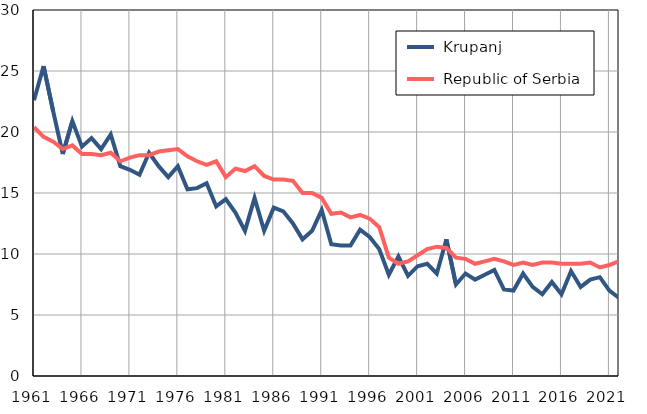
| Category |  Krupanj |  Republic of Serbia |
|---|---|---|
| 1961.0 | 22.6 | 20.4 |
| 1962.0 | 25.4 | 19.6 |
| 1963.0 | 21.7 | 19.2 |
| 1964.0 | 18.2 | 18.6 |
| 1965.0 | 20.9 | 18.9 |
| 1966.0 | 18.8 | 18.2 |
| 1967.0 | 19.5 | 18.2 |
| 1968.0 | 18.6 | 18.1 |
| 1969.0 | 19.8 | 18.3 |
| 1970.0 | 17.2 | 17.6 |
| 1971.0 | 16.9 | 17.9 |
| 1972.0 | 16.5 | 18.1 |
| 1973.0 | 18.3 | 18.1 |
| 1974.0 | 17.2 | 18.4 |
| 1975.0 | 16.3 | 18.5 |
| 1976.0 | 17.2 | 18.6 |
| 1977.0 | 15.3 | 18 |
| 1978.0 | 15.4 | 17.6 |
| 1979.0 | 15.8 | 17.3 |
| 1980.0 | 13.9 | 17.6 |
| 1981.0 | 14.5 | 16.3 |
| 1982.0 | 13.4 | 17 |
| 1983.0 | 11.9 | 16.8 |
| 1984.0 | 14.6 | 17.2 |
| 1985.0 | 11.9 | 16.4 |
| 1986.0 | 13.8 | 16.1 |
| 1987.0 | 13.5 | 16.1 |
| 1988.0 | 12.5 | 16 |
| 1989.0 | 11.2 | 15 |
| 1990.0 | 11.9 | 15 |
| 1991.0 | 13.6 | 14.6 |
| 1992.0 | 10.8 | 13.3 |
| 1993.0 | 10.7 | 13.4 |
| 1994.0 | 10.7 | 13 |
| 1995.0 | 12 | 13.2 |
| 1996.0 | 11.4 | 12.9 |
| 1997.0 | 10.4 | 12.2 |
| 1998.0 | 8.3 | 9.7 |
| 1999.0 | 9.8 | 9.2 |
| 2000.0 | 8.2 | 9.4 |
| 2001.0 | 9 | 9.9 |
| 2002.0 | 9.2 | 10.4 |
| 2003.0 | 8.4 | 10.6 |
| 2004.0 | 11.2 | 10.5 |
| 2005.0 | 7.5 | 9.7 |
| 2006.0 | 8.4 | 9.6 |
| 2007.0 | 7.9 | 9.2 |
| 2008.0 | 8.3 | 9.4 |
| 2009.0 | 8.7 | 9.6 |
| 2010.0 | 7.1 | 9.4 |
| 2011.0 | 7 | 9.1 |
| 2012.0 | 8.4 | 9.3 |
| 2013.0 | 7.3 | 9.1 |
| 2014.0 | 6.7 | 9.3 |
| 2015.0 | 7.7 | 9.3 |
| 2016.0 | 6.7 | 9.2 |
| 2017.0 | 8.6 | 9.2 |
| 2018.0 | 7.3 | 9.2 |
| 2019.0 | 7.9 | 9.3 |
| 2020.0 | 8.1 | 8.9 |
| 2021.0 | 7 | 9.1 |
| 2022.0 | 6.4 | 9.4 |